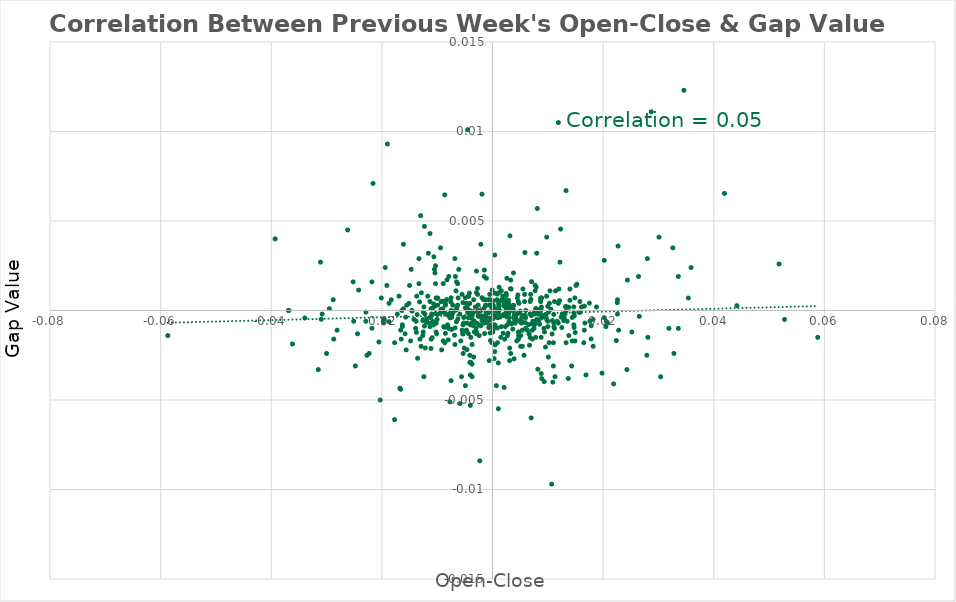
| Category | Series 0 |
|---|---|
| 0.00012000000000000899 | -0.001 |
| 0.008670000000000067 | 0 |
| 0.009610000000000007 | 0 |
| -0.014519999999999977 | 0 |
| -0.01871999999999996 | -0.001 |
| 0.02237 | -0.002 |
| -0.001909999999998968 | -0.001 |
| -0.0019200000000000328 | 0 |
| 0.001920000000001032 | -0.001 |
| 0.0038000000000000256 | 0 |
| 0.00871999999999995 | 0 |
| 0.002990000000000048 | -0.001 |
| 0.005239999999999911 | -0.001 |
| -0.010910000000001085 | -0.002 |
| 0.022560000000001024 | 0 |
| 0.002850000000000019 | 0 |
| -0.003269999999999995 | -0.001 |
| 0.0020499999999999963 | 0 |
| 0.004509999999999903 | 0 |
| 0.007070000000000021 | -0.001 |
| -0.012859999999999983 | 0.001 |
| 0.002909999999999968 | 0 |
| -0.0021200000000000108 | -0.001 |
| -0.011970000000000036 | -0.001 |
| -0.0015899999999999803 | 0 |
| 0.0026000000000000467 | 0 |
| 0.007580000000000031 | -0.001 |
| 0.0010499999999999954 | -0.003 |
| -0.006510000000000016 | 0 |
| 0.0024699999999999722 | 0.001 |
| 0.01662000000000008 | 0 |
| -0.010820000000000052 | 0 |
| -0.00933000000000006 | 0 |
| -0.005490000000001105 | -0.001 |
| 0.006689999999999974 | -0.002 |
| -0.0011099999999999444 | 0 |
| 0.0050000000000000044 | 0 |
| -0.006870000000000043 | -0.001 |
| -0.009929999999999994 | 0 |
| -0.0015800000000000258 | 0 |
| -0.007489999999999997 | -0.004 |
| -0.010300000000000087 | 0.001 |
| -0.0045800000000000285 | 0 |
| -0.007539999999999991 | 0 |
| -0.0036900000000010813 | 0 |
| 0.00034000000000000696 | 0 |
| -0.024210000000000065 | 0.001 |
| 0.011080000000001089 | -0.001 |
| -0.006970000000000032 | 0 |
| 0.01475000000000004 | -0.001 |
| -0.007990000000001052 | -0.002 |
| -0.013619999999999965 | 0 |
| 0.026540000000000008 | 0 |
| -0.0017099999999999893 | 0.001 |
| 5.999999999994898e-05 | -0.001 |
| 0.007009999999999961 | 0 |
| -0.02180000000000004 | -0.001 |
| 7.00000000000145e-05 | -0.001 |
| -0.0014299999999999313 | -0.001 |
| -0.0034399999999999986 | 0 |
| -0.005730000000000013 | -0.002 |
| -0.012149999999999994 | -0.002 |
| -0.004850000000000021 | -0.001 |
| -0.0021700000000000053 | 0 |
| -0.008519999999999972 | -0.001 |
| -0.005319999999999991 | -0.001 |
| 0.00029999999999996696 | -0.003 |
| 0.008809999999999985 | -0.004 |
| -0.030970000000000053 | 0 |
| -0.013749999999999929 | -0.001 |
| -0.011840000000000073 | 0 |
| 0.010560000000000014 | 0 |
| -0.012299999999999978 | -0.001 |
| -0.004350000000000076 | -0.001 |
| -0.003689999999999971 | -0.002 |
| -0.0018700000000000383 | 0 |
| -0.033930000000000016 | 0 |
| 0.015260000000000051 | 0.001 |
| -0.03615999999999997 | -0.002 |
| 0.04418999999999995 | 0 |
| 0.04194000000000009 | 0.007 |
| -0.01674999999999993 | -0.004 |
| 0.00819000000000003 | -0.003 |
| 0.009340000000000015 | -0.004 |
| -0.004919999999998925 | 0.001 |
| 0.0009000000000000119 | -0.001 |
| 0.012410000000000032 | 0 |
| 0.004709999999999992 | -0.001 |
| 0.0022300000000000653 | 0 |
| 0.003950000000000009 | 0 |
| 0.003350000000000075 | -0.001 |
| -0.008709999999999996 | 0 |
| -0.0016400000000000858 | -0.001 |
| -0.0041800000000000725 | 0.001 |
| -0.007390000000000008 | -0.001 |
| 0.0033799999999999386 | 0.001 |
| 0.0029000000000000137 | 0.001 |
| 0.003469999999999973 | -0.001 |
| 0.005530000000001034 | 0 |
| -0.008989999999999942 | 0 |
| 0.0024700000000000832 | 0 |
| -0.0067800000000010074 | -0.001 |
| -0.00385000000000002 | 0 |
| -0.00043999999999999595 | -0.001 |
| 0.0007099999999999884 | 0 |
| 0.009780000000000011 | 0.001 |
| -0.003920000000000035 | -0.002 |
| -0.012530000000000041 | -0.001 |
| 9.99999999995449e-06 | -0.001 |
| 0.002800000000001024 | -0.001 |
| 0.00043000000000004146 | 0 |
| 0.0007700000000000484 | 0 |
| 0.01083999999999996 | -0.001 |
| 0.012970000000000037 | 0 |
| -0.0023800000000000487 | 0 |
| -0.0043199999999999905 | 0 |
| 0.0049000000000000155 | 0 |
| -0.009029999999999982 | 0.001 |
| -0.005360000000001031 | 0 |
| 0.01318000000000108 | 0 |
| -0.006450000000000067 | 0 |
| -0.0001300000000000745 | 0 |
| -0.0015800000000000258 | 0.001 |
| 0.012310000000000043 | 0.005 |
| -0.0029799999999999827 | -0.001 |
| 0.001060000000000061 | -0.005 |
| 0.011079999999999979 | 0 |
| 0.0020599999999999508 | 0 |
| -0.007199999999999984 | 0 |
| 0.0013799999999999368 | 0 |
| -0.0014699999999999713 | 0.002 |
| 0.00042000000000008697 | 0 |
| -0.004609999999998893 | 0 |
| 0.00651999999999997 | -0.001 |
| 0.005860000000000087 | 0.003 |
| 0.0008799999999999919 | 0.001 |
| -0.005199999999999982 | 0 |
| 0.015880000000000005 | 0 |
| -0.00723000000000007 | 0 |
| -0.0013799999999999368 | 0 |
| 0.004790000000000072 | 0 |
| -0.010180000000001077 | -0.001 |
| -0.007680000000001019 | 0 |
| 0.00014999999999998348 | 0.001 |
| 0.013999999999999901 | 0.001 |
| 0.0008500000000000174 | 0 |
| 0.017830000000000013 | -0.002 |
| -0.008630000000000027 | 0.006 |
| 0.008240000000000025 | 0 |
| -0.011120000000000019 | -0.002 |
| -0.003369999999999984 | -0.001 |
| -0.010630000000000028 | -0.001 |
| 0.002670000000000061 | 0 |
| -0.0008200000000000429 | -0.001 |
| -0.006249999999999978 | 0 |
| 0.017510000000000026 | 0 |
| 0.004590000000000094 | 0.001 |
| -0.013539999999999996 | -0.003 |
| -0.0049200000000000355 | 0 |
| 0.00878000000000101 | 0 |
| 0.01324000000000003 | 0 |
| -0.0011699999999988941 | 0 |
| -0.0040400000000000436 | 0 |
| 0.010240000000000027 | -0.002 |
| 9.00000000000345e-05 | 0 |
| 0.0018899999999999473 | 0 |
| 0.00010999999999994348 | 0 |
| 0.0009900000000010456 | 0 |
| -0.0019100000000000783 | 0.001 |
| 0.0028200000000000447 | 0 |
| 8.000000000008001e-05 | 0 |
| 0.014690000000000092 | 0 |
| -0.003489999999999993 | -0.001 |
| -0.0006600000000011041 | 0 |
| -0.00270999999999999 | 0.001 |
| 0.003229999999999955 | 0.001 |
| 9.00000000000345e-05 | 0 |
| 0.003790000000000071 | 0 |
| 0.008399999999999963 | -0.001 |
| 0.009689999999999976 | 0 |
| -0.00831000000000004 | 0.001 |
| 0.001160000000001049 | 0 |
| 0.0024899999999999922 | 0.001 |
| 0.0018599999999999728 | 0.001 |
| 0.013799999999999923 | 0 |
| -0.008500000000000063 | 0 |
| 0.007589999999999986 | 0 |
| 0.006780000000000008 | 0 |
| -0.009399999999998965 | 0 |
| 0.010000000000000009 | 0 |
| 0.017860000000001097 | -0.001 |
| -0.010670000000000068 | -0.001 |
| -0.00822999999999996 | 0.002 |
| -0.005310000000000037 | -0.001 |
| -0.002569999999999961 | 0 |
| -0.01317999999999997 | 0 |
| 0.008259999999999934 | 0 |
| 0.00048000000000003595 | -0.002 |
| -0.0046800000000000175 | 0 |
| 0.008849999999999913 | 0 |
| -0.0009600000000000719 | -0.001 |
| 0.0024300000000010424 | 0 |
| 0.014399999999999968 | 0 |
| 0.006939999999999946 | 0.001 |
| -0.011960000000000082 | -0.001 |
| 0.005929999999999991 | -0.001 |
| 0.01212000000000002 | 0.001 |
| 0.003670000000000062 | -0.001 |
| 0.005550000000000055 | 0 |
| -0.010660000000000003 | 0 |
| -0.0046199999999999575 | -0.002 |
| -0.0006700000000000594 | -0.001 |
| -0.0035000000000000586 | 0 |
| 0.0025000000000000577 | 0 |
| 0.004769999999999941 | -0.001 |
| -0.00819000000000003 | -0.001 |
| -0.008639999999999981 | -0.001 |
| -0.022889999999999966 | 0 |
| 0.007809999999999984 | -0.001 |
| -0.012510000000000021 | -0.001 |
| 0.0047800000000000065 | -0.001 |
| -0.008660000000000001 | 0 |
| -0.01036999999999999 | 0 |
| -0.00036000000000002697 | -0.002 |
| 0.00041999999999997595 | -0.001 |
| -0.00651999999999997 | -0.001 |
| 0.0024899999999999922 | 0 |
| 0.005289999999999906 | 0 |
| 0.009580000000000033 | -0.002 |
| 0.003149999999999986 | 0.004 |
| -0.008519999999999972 | 0 |
| 0.01252999999999993 | -0.001 |
| 0.0009500000000000064 | 0 |
| 0.007709999999999995 | 0.001 |
| -0.015699999999999936 | 0 |
| 0.0046599999999999975 | 0.001 |
| 0.008510000000000018 | -0.001 |
| -4.999999999899529e-05 | 0.001 |
| 0.0011799999999999589 | 0 |
| 0.000140000000000029 | 0 |
| -0.012580000000000036 | -0.001 |
| 0.00048000000000003595 | 0.001 |
| -0.007369999999999988 | 0 |
| -0.020540000000000003 | -0.002 |
| -0.01030999999999993 | 0 |
| -0.00376999999999994 | -0.001 |
| 0.010770000000000057 | -0.001 |
| 0.014960000000000084 | -0.001 |
| 0.0001300000000000745 | 0 |
| -0.0016599999999999948 | -0.001 |
| -0.010040000000000049 | 0.001 |
| 0.020580000000000043 | -0.001 |
| 0.012859999999999983 | -0.001 |
| -0.007489999999999997 | 0.001 |
| 0.001060000000000061 | 0 |
| 0.001240000000001018 | 0 |
| -0.0012699999999999934 | 0 |
| 0.007060000000000066 | 0.002 |
| -0.0040999999999999925 | 0 |
| -0.01419999999999999 | 0 |
| 0.0047000000000000375 | -0.001 |
| 0.0030000000000000027 | 0 |
| -0.0011999999999999789 | 0 |
| 0.0040999999999999925 | 0 |
| 0.0030999999999999917 | -0.002 |
| -0.0034000000000000696 | 0.001 |
| -0.0026000000000000467 | 0 |
| -0.013900000000000023 | -0.001 |
| 0.0131 | 0 |
| -0.001100000000000101 | 0.002 |
| -0.012199999999999989 | 0 |
| -0.00770000000000004 | -0.005 |
| -0.0040000000000000036 | -0.005 |
| -0.0020999999999999908 | 0.004 |
| -0.0007000000000000339 | 0 |
| -0.01870000000000005 | 0 |
| 0.0040000000000000036 | -0.001 |
| 0.0030999999999999917 | 0 |
| 0.00880000000000003 | -0.002 |
| 0.02279999999999993 | -0.001 |
| 0.009300000000000086 | -0.001 |
| -0.0047000000000000375 | -0.001 |
| -0.017700000000001048 | -0.006 |
| 0.011700000000000044 | -0.001 |
| -0.016299999999998982 | -0.001 |
| 0.00869999999999993 | 0.001 |
| -0.005199999999999982 | -0.001 |
| -0.015800000000000036 | -0.001 |
| -0.031500000000000083 | -0.003 |
| 0.0030000000000000027 | 0 |
| -0.0043999999999999595 | 0.001 |
| -0.0037000000000000366 | 0 |
| 0.0016999999999999238 | 0.001 |
| -0.007900000000000018 | 0 |
| -0.016100000000000003 | 0 |
| 0.01100000000000001 | -0.002 |
| 0.033600000000000074 | 0.002 |
| -0.0033999999999999586 | -0.003 |
| -0.010199999999999987 | 0.001 |
| 0.0029000000000000137 | 0 |
| 0.015100000000000002 | 0.001 |
| -0.014600000000000057 | 0 |
| 0.0038000000000000256 | 0 |
| -0.011500000000000066 | -0.001 |
| -0.010000000000000009 | -0.001 |
| 0.007800000000001028 | -0.001 |
| 0.007199999999999984 | -0.002 |
| 0.0040999999999999925 | -0.001 |
| 0.00539999999999996 | -0.001 |
| -0.028100000000000014 | -0.001 |
| -0.0024999999999989475 | 0 |
| 0.015600000000000058 | 0 |
| -0.011299999999999977 | -0.001 |
| -0.016599999999999948 | -0.001 |
| 0.024399999999999977 | 0.002 |
| 0.013299999999999979 | -0.002 |
| 0.006300000000000083 | -0.001 |
| 0.0036999999999999256 | 0 |
| -0.010800000000000032 | -0.001 |
| -0.0029000000000000137 | 0.001 |
| 0.009400000000001074 | -0.001 |
| 0.0045000000000000595 | 0.001 |
| 0.0030999999999999917 | -0.003 |
| 0.01090000000000002 | -0.004 |
| 0.01100000000000001 | -0.003 |
| -0.0023999999999999577 | -0.001 |
| -0.010400000000000076 | 0.002 |
| 0.0019000000000000128 | 0 |
| 0.018199999999999994 | 0 |
| 0.02079999999999893 | -0.001 |
| -0.011299999999999977 | 0 |
| -0.010199999999999987 | -0.001 |
| -0.0023999999999999577 | -0.001 |
| 0.00039999999999995595 | 0 |
| -0.011299999999999977 | 0.004 |
| -0.0036999999999989264 | -0.001 |
| 0.010399999999999965 | 0.001 |
| 0.0046999999999999265 | -0.002 |
| -0.014700000000000046 | 0.002 |
| 0.007500000000000062 | -0.001 |
| 0.009199999999999986 | 0 |
| 0.0037999999999999146 | 0 |
| -0.007199999999999984 | 0 |
| -0.0006999999999999229 | 0.001 |
| -0.0040000000000000036 | -0.004 |
| 0.011199999999999988 | -0.001 |
| 0.030399999999999983 | -0.004 |
| -0.0015000000000000568 | -0.001 |
| -0.013700000000000045 | 0.001 |
| 0.0033000000000000806 | -0.002 |
| 0.0024000000000000687 | 0 |
| 0.010099999999999998 | 0 |
| 0.006800000000000028 | 0.001 |
| 0.014399999999999968 | -0.002 |
| 0.016899999999998916 | -0.004 |
| 0.010299999999999976 | 0 |
| -0.010299999999999976 | 0.002 |
| 0.01200000000000001 | 0.001 |
| 0.0007000000000010331 | -0.004 |
| -0.0040999999999999925 | 0 |
| -0.00550000000000006 | 0.001 |
| -0.0011999999999999789 | 0.001 |
| 0.007900000000001017 | 0 |
| 0.01660000000000006 | -0.001 |
| 0.008700000000000041 | 0.001 |
| 0.03280000000000005 | -0.002 |
| -0.00539999999999996 | -0.001 |
| -0.0029000000000000137 | -0.001 |
| 9.999999999998899e-05 | -0.001 |
| -0.0043999999999999595 | 0 |
| 0.0035000000000000586 | 0 |
| 0.008000000000000007 | 0 |
| 9.999999999998899e-05 | 0 |
| -0.0011999999999999789 | 0 |
| -0.0029000000000000137 | -0.001 |
| 0.005900000000000016 | 0 |
| -0.0045000000000000595 | 0 |
| 0.0016000000000000458 | -0.001 |
| -0.006299999999999972 | 0 |
| -0.0026000000000000467 | 0 |
| -0.007900000000000018 | 0 |
| 0.013499999999999956 | 0 |
| -0.000500000000000056 | 0 |
| -0.007699999999999929 | 0 |
| -0.00039999999999995595 | 0.001 |
| 0.0052000000000000934 | -0.001 |
| 0.005999999999998895 | 0 |
| -0.011199999999999988 | 0 |
| -0.0040000000000000036 | -0.001 |
| -0.015100000000000002 | 0 |
| -0.006500000000000061 | 0.002 |
| 0.0021999999999999797 | -0.002 |
| -0.01650000000000007 | -0.002 |
| 0.0039000000000000146 | -0.003 |
| 0.007300000000000084 | -0.001 |
| -0.007900000000000018 | 0.002 |
| -0.01970000000000005 | -0.001 |
| -0.006199999999999983 | 0.001 |
| 0.008900000000001018 | 0.001 |
| 0.020500000000000074 | -0.001 |
| -0.0045999999999999375 | -0.001 |
| -0.009899999999999909 | 0 |
| 0.00539999999999996 | -0.002 |
| 0.0027999999999999137 | 0 |
| 0.014900000000000024 | -0.002 |
| 0.0015999999999999348 | 0.001 |
| 0.005799999999999916 | 0.001 |
| 0.020199999999999996 | 0 |
| 0.0010999999999999899 | 0 |
| 0.006000000000000005 | 0 |
| 0.014900000000000024 | 0.001 |
| 0.007799999999998919 | 0 |
| -0.024399999999999977 | -0.001 |
| -0.0036999999999999256 | -0.004 |
| -0.012399999999999967 | 0 |
| 0.006000000000000005 | -0.001 |
| -0.005099999999999993 | -0.002 |
| -0.0044999999999999485 | 0.01 |
| -0.0252 | 0.002 |
| 0.012199999999999989 | 0.003 |
| 0.016100000000000003 | 0 |
| -0.00029999999999996696 | 0 |
| -0.028699999999999948 | -0.002 |
| 0.03539999999999999 | 0.001 |
| -0.00880000000000003 | -0.001 |
| -0.009299999999999975 | 0 |
| 0.00040000000000106617 | 0.003 |
| 0.00660000000000005 | -0.001 |
| 0.009800000000000031 | 0 |
| 0.03589999999999993 | 0.002 |
| -0.017199999999999993 | 0 |
| 0.010700000000000043 | -0.01 |
| 0.008000000000000007 | 0.003 |
| 0.011199999999999988 | 0 |
| 0.027999999999999914 | 0.003 |
| 0.028100000000000014 | -0.002 |
| -0.0029000000000001247 | -0.001 |
| -0.0004999999999999449 | 0.001 |
| 0.022599999999999953 | 0 |
| -0.013800000000000034 | -0.001 |
| 0.0026999999999999247 | -0.001 |
| 0.0026999999999999247 | -0.001 |
| -0.008499999999999952 | 0 |
| -0.020299999999999985 | -0.005 |
| -0.0037000000000000366 | -0.003 |
| 0.008899999999999908 | 0 |
| -0.0039000000000000146 | -0.003 |
| 0.00039999999999995595 | -0.002 |
| 0.010000000000000009 | -0.001 |
| 0.0012000000000000899 | 0.001 |
| 0.00770000000000004 | -0.001 |
| 0.0022999999999999687 | -0.001 |
| -0.0025999999999999357 | 0 |
| -0.010600000000000165 | 0.003 |
| 0.0032000000000000917 | 0 |
| 0.015800000000000036 | 0 |
| -0.008099999999999996 | -0.001 |
| -0.005900000000000016 | 0 |
| 0.0031000000000001027 | 0 |
| -0.01100000000000012 | 0 |
| 0.005499999999999838 | 0.001 |
| -0.0042999999999999705 | 0.001 |
| 0.0011999999999998678 | 0 |
| -0.00529999999999986 | -0.002 |
| -0.007900000000000018 | -0.001 |
| -0.006699999999999928 | 0.002 |
| 0.018199999999999994 | -0.002 |
| 0.007199999999999873 | -0.001 |
| 0.010000000000000009 | -0.001 |
| -0.018299999999999983 | 0.001 |
| -0.008899999999999908 | -0.002 |
| 0.010099999999999998 | -0.003 |
| 0.0025999999999999357 | 0.002 |
| 0.014000000000000012 | 0.001 |
| -0.00010000000000021103 | -0.002 |
| -0.00990000000000002 | 0.001 |
| -0.012599999999999945 | -0.001 |
| -0.012900000000000134 | -0.002 |
| -0.0028999999999999027 | 0.002 |
| 0.0051000000000001044 | -0.001 |
| -0.019400000000000084 | 0.002 |
| 0.0051000000000001044 | -0.002 |
| -0.009399999999999964 | 0.004 |
| -0.021599999999998953 | 0.007 |
| 0.01189999999999991 | 0 |
| 0.008099999999999996 | 0.006 |
| 0.016700000000000048 | -0.001 |
| 0.013500000000000068 | -0.001 |
| 0.027900000000000036 | -0.002 |
| -0.010099999999999998 | -0.001 |
| -0.000500000000000167 | -0.001 |
| -0.00749999999999984 | 0 |
| 0.013800000000000034 | -0.001 |
| 0.011900000000000022 | 0.01 |
| 0.012599999999999945 | 0 |
| -0.0030999999999998806 | 0 |
| 0.01649999999999996 | -0.002 |
| -0.0026999999999999247 | 0.001 |
| 0.00770000000000004 | 0.001 |
| -0.0019000000000000128 | 0.006 |
| 0.007900000000000018 | 0.001 |
| -0.01309999999999989 | -0.002 |
| -0.017699999999999827 | -0.002 |
| -0.019600000000000062 | 0 |
| -0.012399999999999967 | -0.004 |
| -0.0005999999999999339 | -0.003 |
| -0.006599999999999939 | 0.001 |
| -0.015499999999999958 | 0 |
| 0.022599999999999953 | 0.001 |
| 0.004200000000000204 | 0 |
| -0.03930000000000011 | 0.004 |
| 0.02870000000000006 | 0.011 |
| 0.033600000000000074 | -0.001 |
| 0.013299999999999867 | 0.007 |
| 0.03259999999999996 | 0.003 |
| -0.036800000000000166 | 0 |
| -0.0049000000000001265 | -0.004 |
| -0.058700000000000085 | -0.001 |
| -0.011099999999999999 | -0.002 |
| 0.014800000000000035 | 0 |
| 0.05180000000000007 | 0.003 |
| 0.006999999999999895 | -0.006 |
| 0.013700000000000045 | -0.004 |
| -0.005600000000000049 | -0.004 |
| -0.019099999999999895 | 0.001 |
| -0.0040999999999999925 | -0.002 |
| 0.006899999999999906 | 0.001 |
| 0.05879999999999996 | -0.002 |
| -0.016100000000000003 | 0.004 |
| -0.022699999999999942 | -0.002 |
| 0.005700000000000038 | -0.002 |
| 0.0020999999999999908 | -0.004 |
| -0.028799999999999937 | 0.001 |
| 0.01110000000000011 | -0.001 |
| -0.009200000000000097 | -0.002 |
| 0.017599999999999838 | -0.001 |
| 0.0008000000000001339 | 0 |
| -0.006099999999999994 | 0.002 |
| -0.008600000000000163 | -0.002 |
| 0.014699999999999935 | 0 |
| 0.02639999999999998 | 0.002 |
| -0.02289999999999992 | -0.001 |
| -0.016899999999999915 | 0.001 |
| -0.00039999999999995595 | 0 |
| -0.01639999999999997 | 0 |
| -0.014999999999999902 | 0.001 |
| -0.030000000000000027 | -0.002 |
| 0.018799999999999928 | 0 |
| 0.0007999999999999119 | 0.001 |
| 0.0011999999999998678 | 0.001 |
| -0.0040999999999999925 | -0.003 |
| -0.01629999999999998 | -0.001 |
| 0.011299999999999866 | -0.004 |
| -0.02510000000000001 | -0.001 |
| -0.005900000000000016 | -0.005 |
| 0.0009000000000000119 | -0.002 |
| 0.0037999999999999146 | 0.002 |
| 0.02429999999999999 | -0.003 |
| -0.022299999999999986 | -0.002 |
| -0.016599999999999948 | -0.004 |
| -0.0043999999999999595 | 0 |
| 0.0044000000000000705 | -0.002 |
| -0.024800000000000044 | -0.003 |
| 0.022699999999999942 | 0.004 |
| 0.0022999999999999687 | 0.001 |
| 0.030099999999999905 | 0.004 |
| -0.02949999999999997 | 0 |
| 0.0032999999999999696 | 0.002 |
| 0.00979999999999892 | 0.004 |
| -0.0015000000000000568 | 0.002 |
| -0.012299999999999978 | 0.005 |
| -0.011099999999999999 | 0 |
| -0.02180000000000004 | 0.002 |
| -0.006299999999999972 | 0.002 |
| -0.011600000000001054 | 0.003 |
| -0.014800000000001035 | -0.002 |
| -0.01330000000000009 | 0.003 |
| -0.002300000000001079 | -0.008 |
| 0.0252 | -0.001 |
| -0.012500000000000067 | 0 |
| -0.008900000000000019 | 0.001 |
| -0.03079999999999994 | 0 |
| 0.008900000000001018 | -0.004 |
| -0.03689999999999993 | 0 |
| 0.03189999999999993 | -0.001 |
| 0.00759999999999994 | 0 |
| -0.019000000000000017 | 0.009 |
| -0.031100000000000017 | 0.003 |
| 0.02189999999999992 | -0.004 |
| -0.015599999999999947 | -0.002 |
| 0.05280000000000007 | 0 |
| 0.014699999999999935 | -0.001 |
| 0.034599999999999964 | 0.012 |
| 0.0014999999999999458 | -0.002 |
| -0.006800000000000028 | -0.002 |
| 0.01429999999999998 | -0.003 |
| -0.0129999999999999 | 0.005 |
| -0.013299999999999979 | 0.002 |
| 0.011399999999999966 | 0.001 |
| 0.0027000000000000357 | 0 |
| -0.006800000000000028 | 0.003 |
| -0.011699999999999933 | 0.001 |
| 0.005800000000000027 | 0.001 |
| -0.010500000000000065 | 0.002 |
| -0.020100000000001006 | 0.001 |
| 0.011900000000000022 | -0.001 |
| 0.01980000000000004 | -0.003 |
| 0.020199999999999996 | 0.003 |
| 0.006800000000000028 | -0.002 |
| -0.0262 | 0.005 |